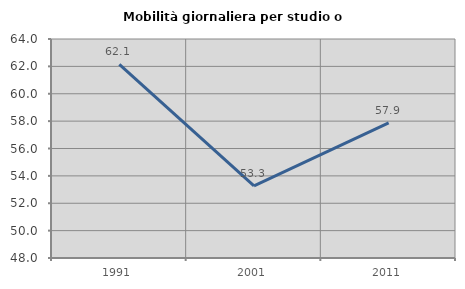
| Category | Mobilità giornaliera per studio o lavoro |
|---|---|
| 1991.0 | 62.147 |
| 2001.0 | 53.273 |
| 2011.0 | 57.875 |